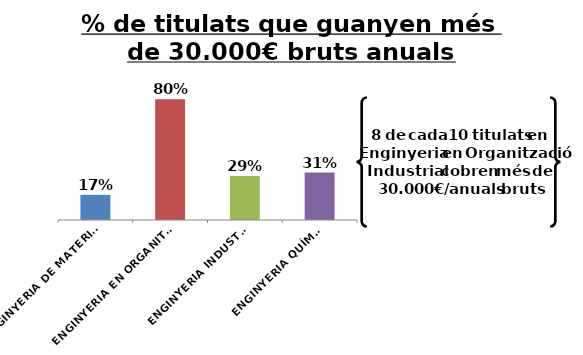
| Category | Series 0 |
|---|---|
| ENGINYERIA DE MATERIALS | 0.167 |
| ENGINYERIA EN ORGANITZACIÓ INDUSTRIAL | 0.8 |
| ENGINYERIA INDUSTRIAL | 0.291 |
| ENGINYERIA QUÍMICA | 0.314 |